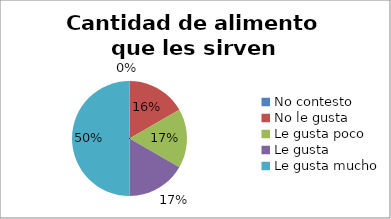
| Category | Series 0 |
|---|---|
| No contesto | 0 |
| No le gusta | 1 |
| Le gusta poco | 1 |
| Le gusta | 1 |
| Le gusta mucho | 3 |